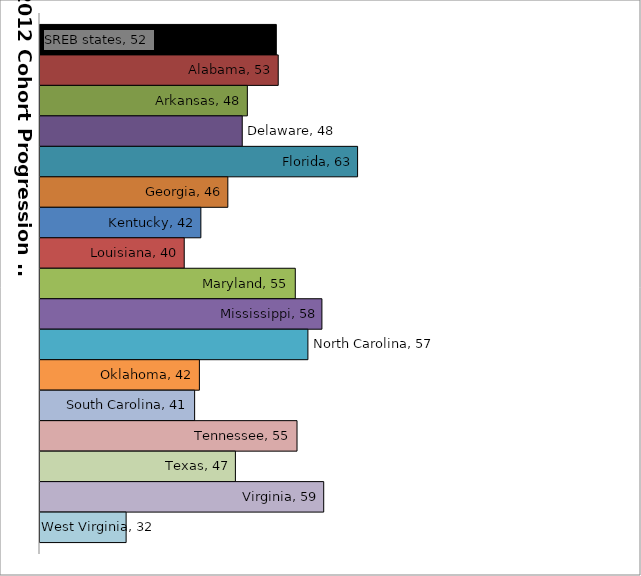
| Category | SREB states | Alabama | Arkansas | Delaware | Florida | Georgia | Kentucky | Louisiana | Maryland | Mississippi | North Carolina | Oklahoma | South Carolina | Tennessee | Texas | Virginia | West Virginia |
|---|---|---|---|---|---|---|---|---|---|---|---|---|---|---|---|---|---|
| 0 | 52.261 | 52.522 | 48.307 | 47.61 | 63.356 | 45.643 | 41.962 | 39.689 | 54.851 | 58.487 | 56.576 | 41.761 | 41.11 | 55.088 | 46.675 | 58.731 | 31.758 |